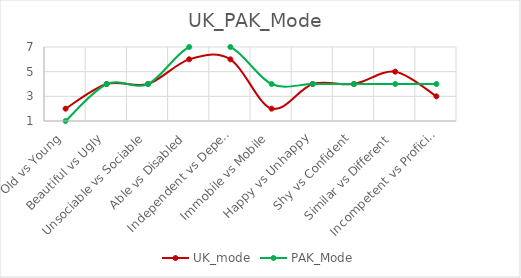
| Category | UK_mode | PAK_Mode |
|---|---|---|
| Old vs Young | 2 | 1 |
|  Beautiful vs Ugly | 4 | 4 |
| Unsociable vs Sociable | 4 | 4 |
| Able vs Disabled | 6 | 7 |
| Independent vs Dependent | 6 | 7 |
| Immobile vs Mobile | 2 | 4 |
| Happy vs Unhappy | 4 | 4 |
| Shy vs Confident | 4 | 4 |
| Similar vs Different | 5 | 4 |
| Incompetent vs Proficient | 3 | 4 |